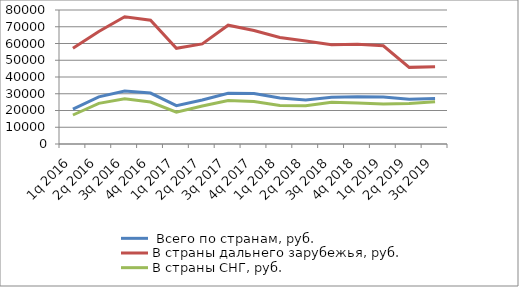
| Category |  Всего по странам, руб. | В страны дальнего зарубежья, руб. | В страны СНГ, руб. |
|---|---|---|---|
| 1q 2016 | 20881.28 | 57093.12 | 17312.96 |
| 2q 2016 | 28150.08 | 67203.36 | 24251.36 |
| 3q 2016 | 31652.32 | 75992 | 27026.72 |
| 4q 2016 | 30396.8 | 73877.44 | 25044.32 |
| 1q 2017 | 22907.97 | 57124.2 | 19002.54 |
| 2q 2017 | 26288.79 | 59747.25 | 22674.81 |
| 3q 2017 | 30252.51 | 70938.93 | 25997.34 |
| 4q 2017 | 30135.93 | 67732.98 | 25356.15 |
| 1q 2018 | 27458.22 | 63567.66 | 22944.54 |
| 2q 2018 | 26329.8 | 61436.2 | 22819.16 |
| 3q 2018 | 27959.74 | 59304.74 | 24950.62 |
| 4q 2018 | 28210.5 | 59555.5 | 24449.1 |
| 1q 2019 | 28084.14 | 58627.26 | 23813.28 |
| 2q 2019 | 26725.23 | 45749.97 | 24201.54 |
| 3q 2019 | 27113.49 | 46073.52 | 25172.19 |